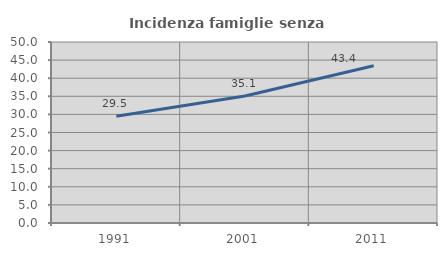
| Category | Incidenza famiglie senza nuclei |
|---|---|
| 1991.0 | 29.487 |
| 2001.0 | 35.089 |
| 2011.0 | 43.449 |